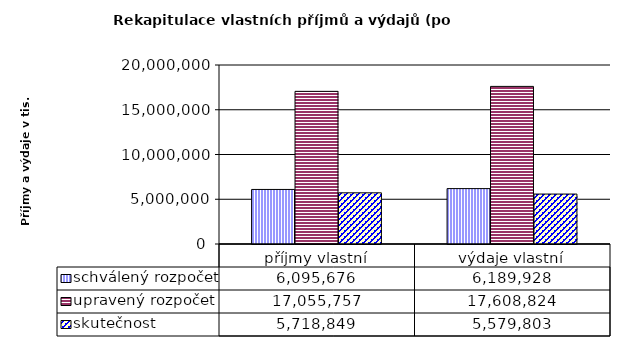
| Category | schválený rozpočet | upravený rozpočet | skutečnost |
|---|---|---|---|
| příjmy vlastní | 6095676 | 17055757 | 5718849 |
| výdaje vlastní | 6189928 | 17608824 | 5579803 |